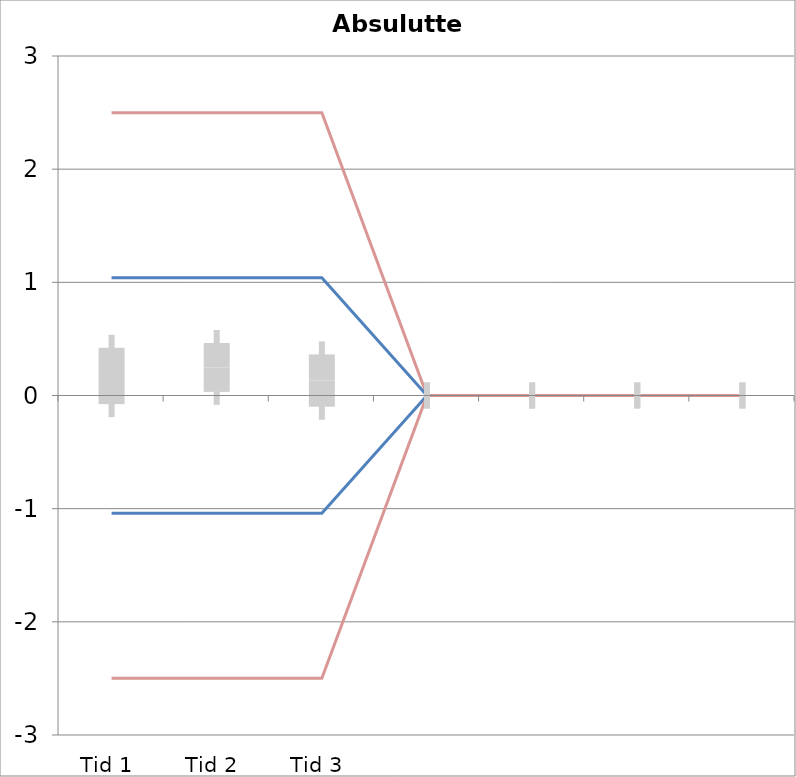
| Category | 1 | 2 | 3 | 4 | 5 | 6 | 7 | 8 | 9 | 10 | 11 | 12 | 13 | 14 | 15 | 16 | 17 | 18 | 19 | 20 | TEa | B | -B | -TEa | M |
|---|---|---|---|---|---|---|---|---|---|---|---|---|---|---|---|---|---|---|---|---|---|---|---|---|---|
| Tid 1 | 1.2 | 0.1 | 0.1 | 0 | 0.3 | 0.1 | -0.2 | 0 | 0.15 | -0.67 | 0.15 | 0.24 | -0.19 | -0.22 | 0.08 | -0.01 | 0.03 | 0.16 | 1.91 | 0.22 | 2.499 | 1.039 | -1.039 | -2.499 | 0.172 |
| Tid 2 | 1 | 0.1 | 0.5 | -0.1 | 0.1 | 1.7 | 0.1 | 0 | 0.07 | 0.29 | 0.41 | 0.33 | -0.04 | -0.3 | -0.01 | -0.02 | 0.12 | 0.12 | 0 | 0.34 | 2.499 | 1.039 | -1.039 | -2.499 | 0.248 |
| Tid 3 | 0.6 | 0 | -0.2 | -0.5 | -0.1 | 0.8 | -0.1 | -0.1 | 0.04 | -0.13 | -0.01 | 0.22 | -0.18 | -0.3 | 0.18 | -0.1 | 0.21 | 0.11 | 1.79 | 0.41 | 2.499 | 1.039 | -1.039 | -2.499 | 0.132 |